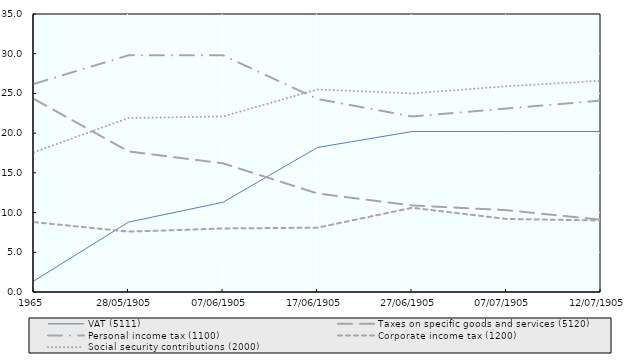
| Category | VAT (5111) | Taxes on specific goods and services (5120) | Personal income tax (1100) | Corporate income tax (1200) | Social security contributions (2000) |
|---|---|---|---|---|---|
| 1965 | 1.4 | 24.3 | 26.2 | 8.8 | 17.6 |
| 1975 | 8.8 | 17.7 | 29.8 | 7.6 | 21.9 |
| 1985 | 11.3 | 16.2 | 29.8 | 8 | 22.1 |
| 1995 | 18.2 | 12.4 | 24.3 | 8.1 | 25.5 |
| 2005 | 20.2 | 10.9 | 22.1 | 10.6 | 25 |
| 2015 | 20.2 | 10.3 | 23.1 | 9.2 | 25.9 |
| 2020 | 20.2 | 9.1 | 24.1 | 9 | 26.6 |